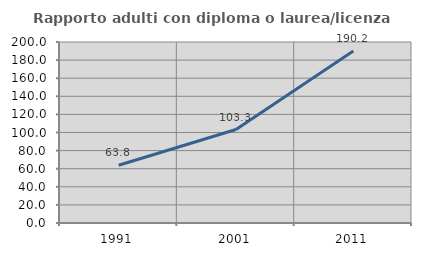
| Category | Rapporto adulti con diploma o laurea/licenza media  |
|---|---|
| 1991.0 | 63.806 |
| 2001.0 | 103.279 |
| 2011.0 | 190.171 |